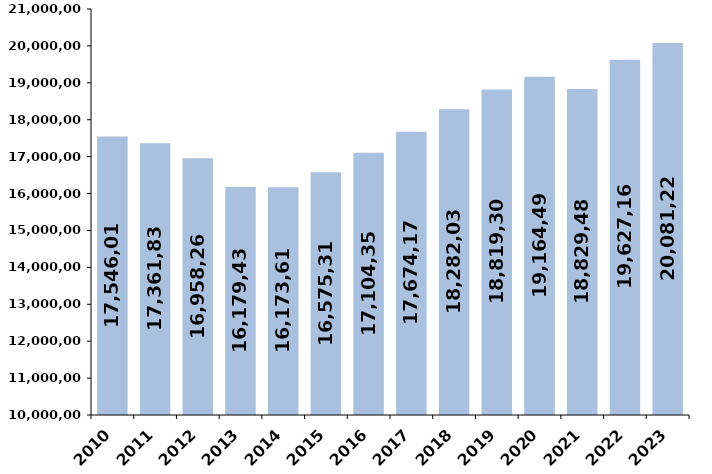
| Category | % de variación
 interanual |
|---|---|
| 2010 | 17546011.05 |
| 2011 | 17361838.5 |
| 2012 | 16958267.14 |
| 2013 | 16179438.04 |
| 2014 | 16173609.52 |
| 2015 | 16575312.25 |
| 2016 | 17104357.22 |
| 2017 | 17674174.5 |
| 2018 | 18282030.81 |
| 2019 | 18819300.09 |
| 2020 | 19164493.64 |
| 2021 | 18829480 |
| 2022 | 19627161 |
| 2023 | 20081223.905 |